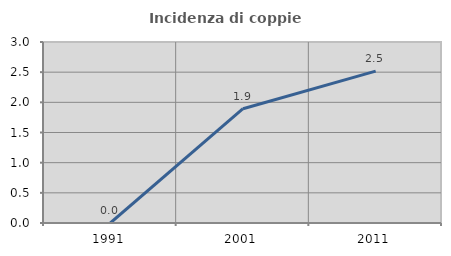
| Category | Incidenza di coppie miste |
|---|---|
| 1991.0 | 0 |
| 2001.0 | 1.894 |
| 2011.0 | 2.518 |